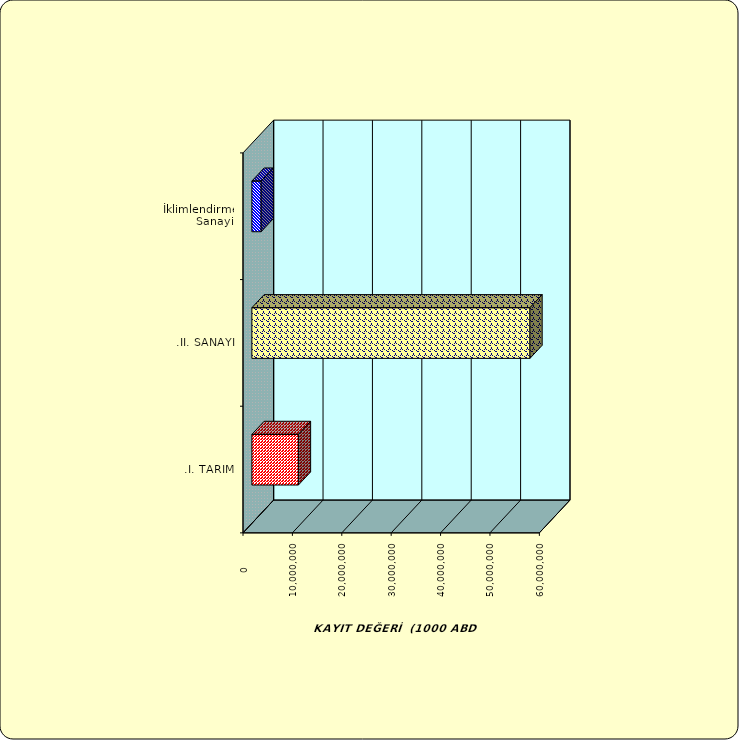
| Category | Series 0 |
|---|---|
| .I. TARIM | 9415389.31 |
| .II. SANAYİ | 56296632.703 |
|  İklimlendirme Sanayii | 1875260.144 |